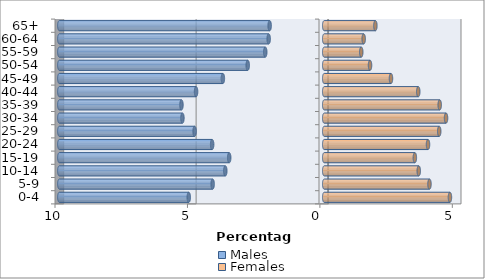
| Category | Males | Females |
|---|---|---|
| 0-4 | -5.114 | 4.746 |
| 5-9 | -4.213 | 3.974 |
| 10-14 | -3.734 | 3.569 |
| 15-19 | -3.587 | 3.422 |
| 20-24 | -4.231 | 3.918 |
| 25-29 | -4.893 | 4.341 |
| 30-34 | -5.353 | 4.599 |
| 35-39 | -5.39 | 4.36 |
| 40-44 | -4.838 | 3.55 |
| 45-49 | -3.826 | 2.52 |
| 50-54 | -2.888 | 1.729 |
| 55-59 | -2.226 | 1.398 |
| 60-64 | -2.097 | 1.49 |
| 65+ | -2.06 | 1.932 |